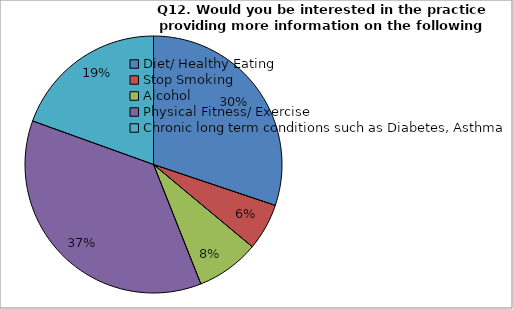
| Category | Series 0 |
|---|---|
| Diet/ Healthy Eating | 133 |
| Stop Smoking | 26 |
| Alcohol  | 35 |
| Physical Fitness/ Exercise | 161 |
| Chronic long term conditions such as Diabetes, Asthma | 86 |